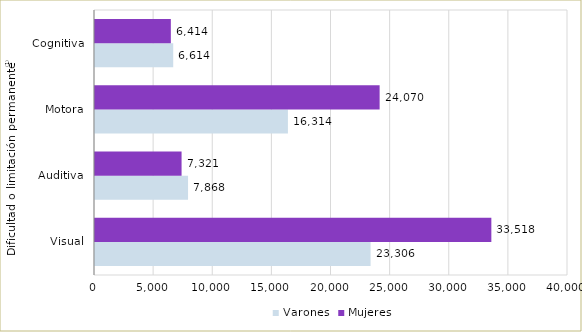
| Category | Varones | Mujeres |
|---|---|---|
| Visual | 23306 | 33518 |
| Auditiva | 7868 | 7321 |
| Motora | 16314 | 24070 |
| Cognitiva | 6614 | 6414 |